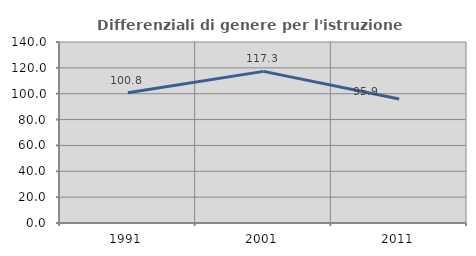
| Category | Differenziali di genere per l'istruzione superiore |
|---|---|
| 1991.0 | 100.827 |
| 2001.0 | 117.284 |
| 2011.0 | 95.927 |